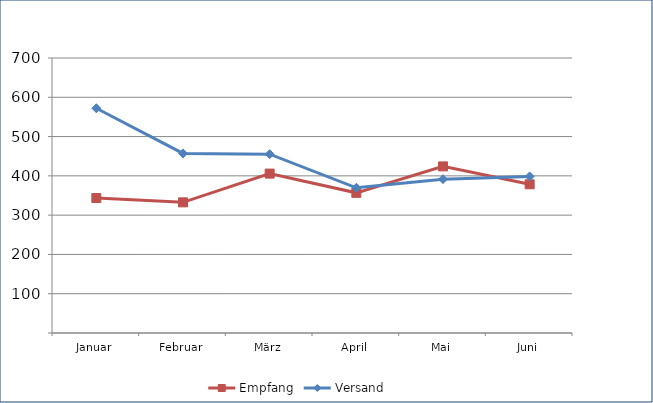
| Category | Empfang | Versand |
|---|---|---|
| Januar | 343.572 | 572.088 |
| Februar | 332.565 | 457.144 |
| März | 405.731 | 455.236 |
| April | 356.788 | 369.516 |
| Mai | 424.071 | 391.59 |
| Juni | 378.509 | 398.544 |